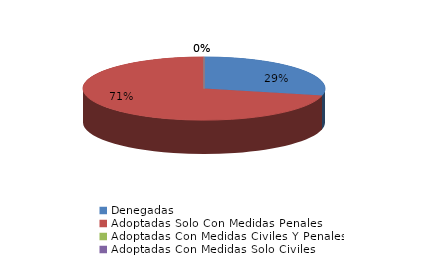
| Category | Series 0 |
|---|---|
| Denegadas | 2 |
| Adoptadas Solo Con Medidas Penales | 5 |
| Adoptadas Con Medidas Civiles Y Penales | 0 |
| Adoptadas Con Medidas Solo Civiles | 0 |